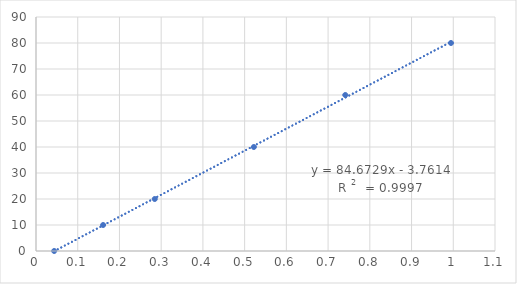
| Category | Series 0 |
|---|---|
| 0.043500000000000004 | 0 |
| 0.16083333333333333 | 10 |
| 0.28458333333333335 | 20 |
| 0.5220833333333333 | 40 |
| 0.7411666666666665 | 60 |
| 0.9944999999999999 | 80 |